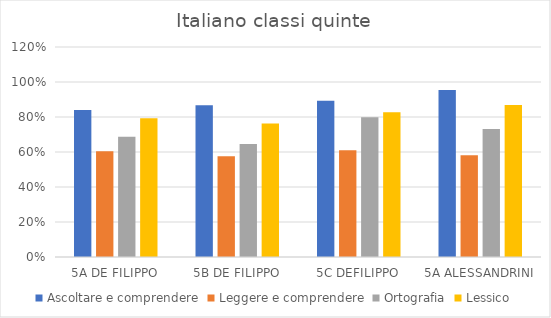
| Category | Ascoltare e comprendere | Leggere e comprendere | Ortografia | Lessico |
|---|---|---|---|---|
| 5A DE FILIPPO | 0.84 | 0.605 | 0.688 | 0.792 |
| 5B DE FILIPPO | 0.867 | 0.576 | 0.646 | 0.763 |
| 5C DEFILIPPO | 0.893 | 0.609 | 0.799 | 0.826 |
| 5A ALESSANDRINI | 0.954 | 0.581 | 0.731 | 0.869 |